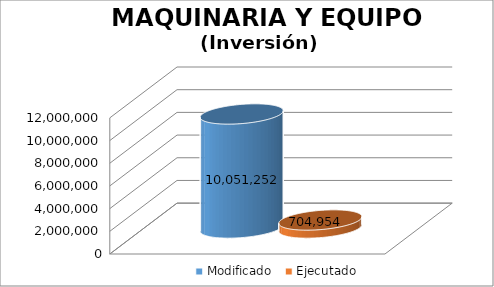
| Category | Modificado | Ejecutado |
|---|---|---|
| 0 | 10051252 | 704953.72 |